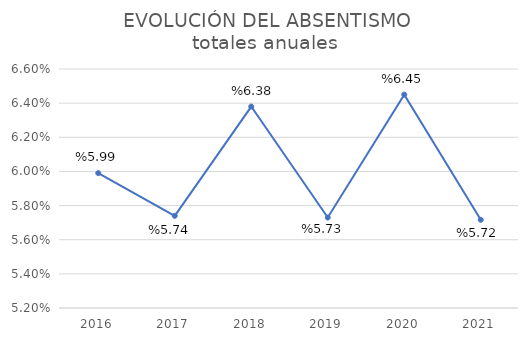
| Category | Total |
|---|---|
| 2016.0 | 0.06 |
| 2017.0 | 0.057 |
| 2018.0 | 0.064 |
| 2019.0 | 0.057 |
| 2020.0 | 0.064 |
| 2021.0 | 0.057 |